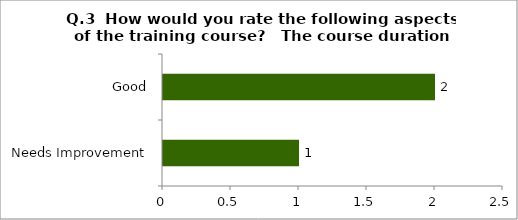
| Category | Q.3  How would you rate the following aspects of the training course?  |
|---|---|
| Needs Improvement | 1 |
| Good | 2 |